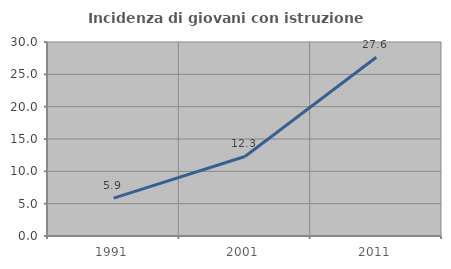
| Category | Incidenza di giovani con istruzione universitaria |
|---|---|
| 1991.0 | 5.868 |
| 2001.0 | 12.297 |
| 2011.0 | 27.64 |